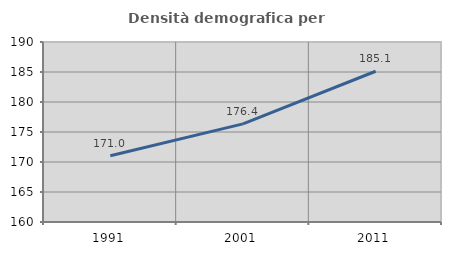
| Category | Densità demografica |
|---|---|
| 1991.0 | 171.033 |
| 2001.0 | 176.35 |
| 2011.0 | 185.126 |